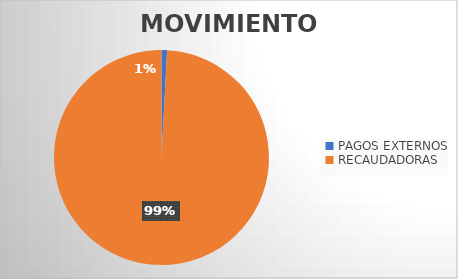
| Category | MOVIMIENTOS |
|---|---|
| PAGOS EXTERNOS | 180 |
| RECAUDADORAS | 21351 |